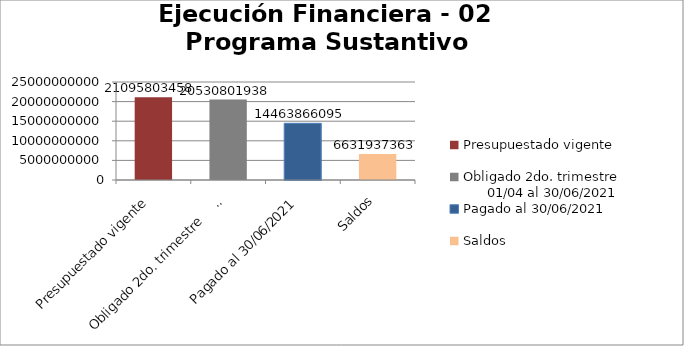
| Category | 4.8 Ejecución Financiera (Generar gráfica) |
|---|---|
| Presupuestado vigente | 21095803458 |
| Obligado 2do. trimestre                      01/04 al 30/06/2021 | 20530801938 |
| Pagado al 30/06/2021 | 14463866095 |
| Saldos | 6631937363 |